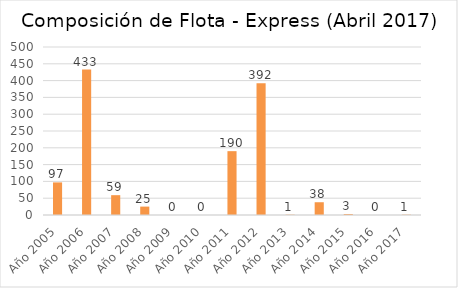
| Category | Series 0 |
|---|---|
| Año 2005 | 97 |
| Año 2006 | 433 |
| Año 2007 | 59 |
| Año 2008 | 25 |
| Año 2009 | 0 |
| Año 2010 | 0 |
| Año 2011 | 190 |
| Año 2012 | 392 |
| Año 2013 | 1 |
| Año 2014 | 38 |
| Año 2015 | 3 |
| Año 2016 | 0 |
| Año 2017 | 1 |